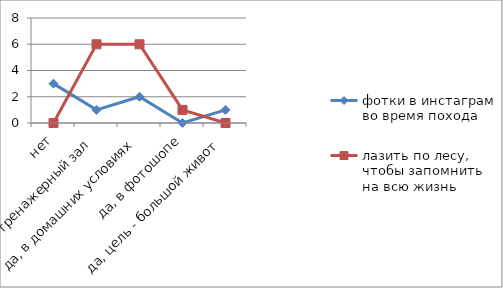
| Category | фотки в инстаграм во время похода | лазить по лесу, чтобы запомнить на всю жизнь |
|---|---|---|
| нет | 3 | 0 |
| да, в тренажерный зал | 1 | 6 |
| да, в домашних условиях | 2 | 6 |
| да, в фотошопе | 0 | 1 |
| да, цель - большой живот | 1 | 0 |